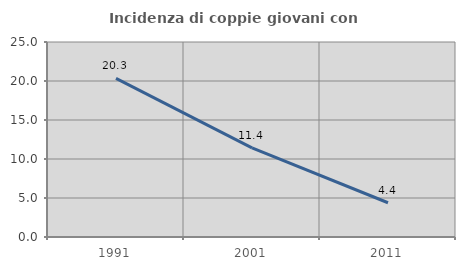
| Category | Incidenza di coppie giovani con figli |
|---|---|
| 1991.0 | 20.326 |
| 2001.0 | 11.416 |
| 2011.0 | 4.39 |